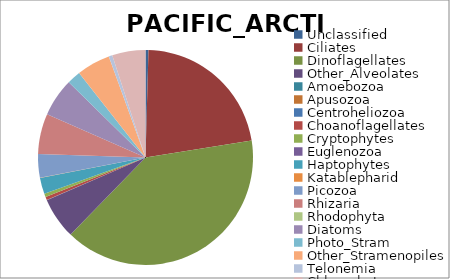
| Category | PACIFIC_ARCTIC |
|---|---|
| Unclassified | 0.004 |
| Ciliates | 0.22 |
| Dinoflagellates | 0.398 |
| Other_Alveolates | 0.062 |
| Amoebozoa | 0 |
| Apusozoa | 0 |
| Centroheliozoa | 0 |
| Choanoflagellates | 0.005 |
| Cryptophytes | 0.005 |
| Euglenozoa | 0 |
| Haptophytes | 0.024 |
| Katablepharid | 0 |
| Picozoa | 0.035 |
| Rhizaria | 0.061 |
| Rhodophyta | 0 |
| Diatoms | 0.058 |
| Photo_Stram | 0.021 |
| Other_Stramenopiles | 0.051 |
| Telonemia | 0.005 |
| Chlorophytes | 0.05 |